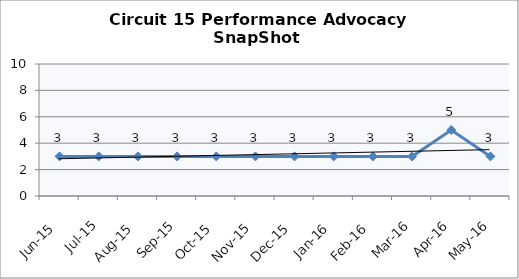
| Category | Circuit 15 |
|---|---|
| Jun-15 | 3 |
| Jul-15 | 3 |
| Aug-15 | 3 |
| Sep-15 | 3 |
| Oct-15 | 3 |
| Nov-15 | 3 |
| Dec-15 | 3 |
| Jan-16 | 3 |
| Feb-16 | 3 |
| Mar-16 | 3 |
| Apr-16 | 5 |
| May-16 | 3 |